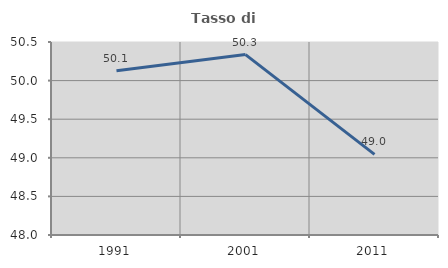
| Category | Tasso di occupazione   |
|---|---|
| 1991.0 | 50.128 |
| 2001.0 | 50.337 |
| 2011.0 | 49.044 |